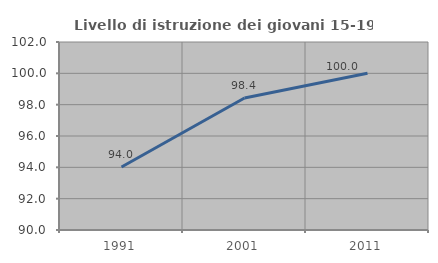
| Category | Livello di istruzione dei giovani 15-19 anni |
|---|---|
| 1991.0 | 94.017 |
| 2001.0 | 98.425 |
| 2011.0 | 100 |